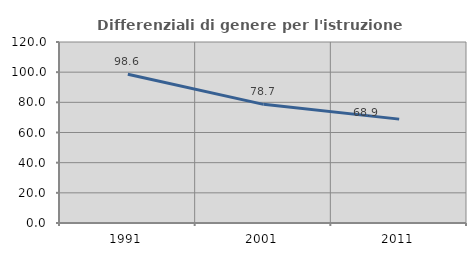
| Category | Differenziali di genere per l'istruzione superiore |
|---|---|
| 1991.0 | 98.575 |
| 2001.0 | 78.667 |
| 2011.0 | 68.872 |